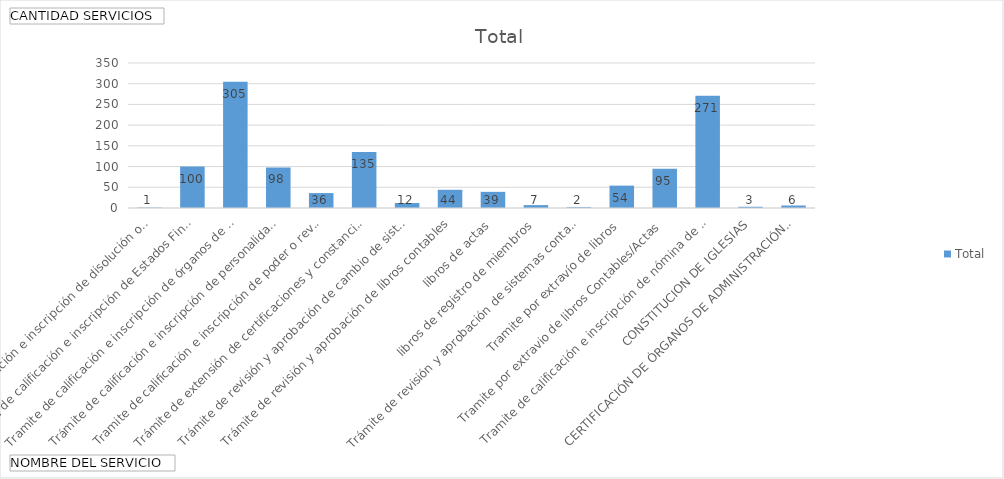
| Category | Total |
|---|---|
| Tramite de calificación e inscripción de disolución o liquidación | 1 |
| Tramite de calificación e inscripción de Estados Financieros | 100 |
| Tramite de calificación e inscripción de órganos de administración  | 305 |
| Trámite de calificación e inscripción de personalidad jurídica y estatutos | 98 |
| Tramite de calificación e inscripción de poder o revocatoria | 36 |
| Trámite de extensión de certificaciones y constancias | 135 |
| Trámite de revisión y aprobación de cambio de sistema contable informal a formal | 12 |
| Trámite de revisión y aprobación de libros contables, libros de actas, libros de registro de miembros | 44 |
| Trámite de revisión y aprobación de sistemas contables formales e informales | 39 |
| Tramite por extravío de libros | 7 |
| Tramite por extravio de libros Contables/Actas | 2 |
| Tramite de calificación e inscripción de nómina de miembros | 54 |
| CONSTITUCION DE IGLESIAS | 95 |
| CERTIFICACIÓN DE ÓRGANOS DE ADMINISTRACIÓN Y NÓMINAS DE MIEMBROS PARA IGLESIAS | 271 |
| Trámite de calificación e inscripción de acuerdo de autorización de funcionamiento en el país de entidad extranjera | 3 |
| Trámite de calificación e inscripción de derogatoria o reforma de estatutos | 6 |